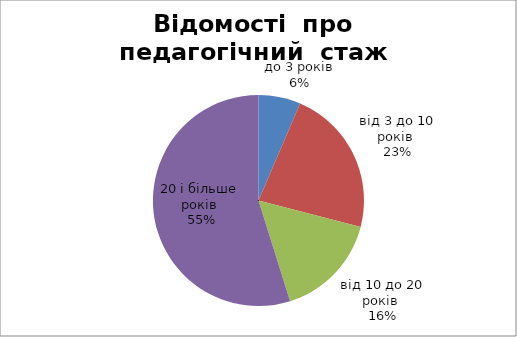
| Category | Series 0 |
|---|---|
| до 3 років | 2 |
| від 3 до 10 років  | 7 |
| від 10 до 20 років  | 5 |
| 20 і більше  років  | 17 |